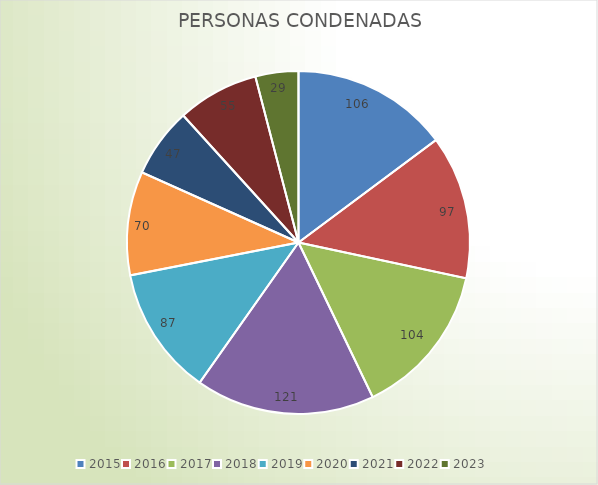
| Category |  PERSONAS CONDENADAS |
|---|---|
| 2015.0 | 106 |
| 2016.0 | 97 |
| 2017.0 | 104 |
| 2018.0 | 121 |
| 2019.0 | 87 |
| 2020.0 | 70 |
| 2021.0 | 47 |
| 2022.0 | 55 |
| 2023.0 | 29 |